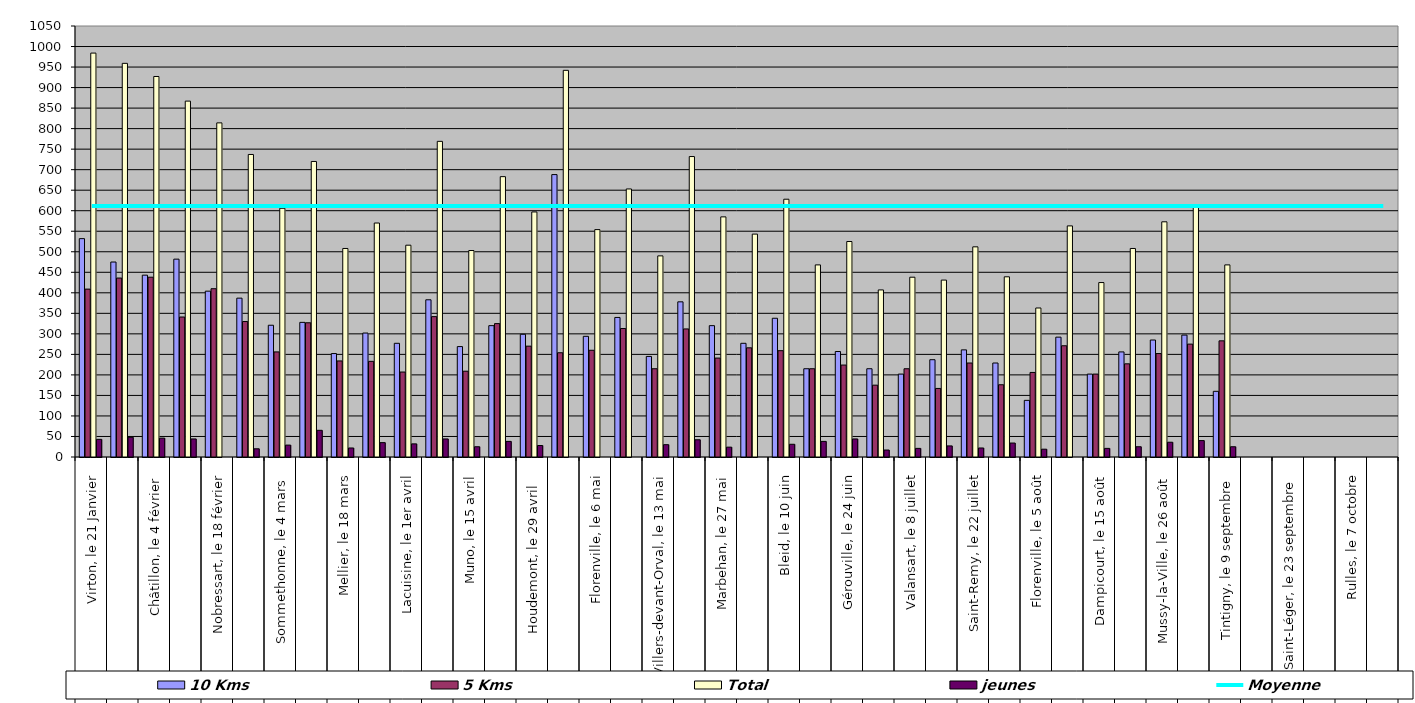
| Category | 10 Kms | 5 Kms | Total | jeunes |
|---|---|---|---|---|
| 0 | 532 | 409 | 984 | 43 |
| 1 | 475 | 436 | 959 | 48 |
| 2 | 443 | 438 | 927 | 46 |
| 3 | 482 | 341 | 867 | 44 |
| 4 | 404 | 410 | 814 | 0 |
| 5 | 387 | 330 | 737 | 20 |
| 6 | 321 | 256 | 606 | 29 |
| 7 | 328 | 327 | 720 | 65 |
| 8 | 252 | 234 | 508 | 22 |
| 9 | 302 | 233 | 570 | 35 |
| 10 | 277 | 207 | 516 | 32 |
| 11 | 383 | 342 | 769 | 44 |
| 12 | 269 | 209 | 503 | 25 |
| 13 | 320 | 325 | 683 | 38 |
| 14 | 299 | 270 | 597 | 28 |
| 15 | 688 | 254 | 942 | 0 |
| 16 | 294 | 260 | 554 | 0 |
| 17 | 340 | 313 | 653 | 0 |
| 18 | 245 | 215 | 490 | 30 |
| 19 | 378 | 312 | 732 | 42 |
| 20 | 320 | 241 | 585 | 24 |
| 21 | 277 | 266 | 543 | 0 |
| 22 | 338 | 259 | 628 | 31 |
| 23 | 215 | 215 | 468 | 38 |
| 24 | 257 | 224 | 525 | 44 |
| 25 | 215 | 175 | 407 | 17 |
| 26 | 202 | 215 | 438 | 21 |
| 27 | 237 | 167 | 431 | 27 |
| 28 | 261 | 229 | 512 | 22 |
| 29 | 229 | 176 | 439 | 34 |
| 30 | 138 | 206 | 363 | 19 |
| 31 | 292 | 271 | 563 | 0 |
| 32 | 202 | 202 | 425 | 21 |
| 33 | 256 | 227 | 508 | 25 |
| 34 | 285 | 252 | 573 | 36 |
| 35 | 297 | 275 | 612 | 40 |
| 36 | 160 | 283 | 468 | 25 |
| 37 | 0 | 0 | 0 | 0 |
| 38 | 0 | 0 | 0 | 0 |
| 39 | 0 | 0 | 0 | 0 |
| 40 | 0 | 0 | 0 | 0 |
| 41 | 0 | 0 | 0 | 0 |